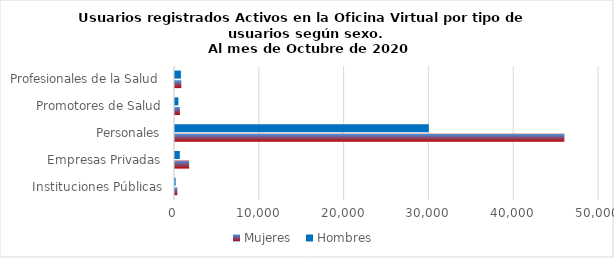
| Category | Mujeres | Hombres |
|---|---|---|
| Instituciones Públicas | 275 | 73 |
| Empresas Privadas | 1668 | 570 |
| Personales | 45918 | 29932 |
| Promotores de Salud | 583 | 400 |
| Profesionales de la Salud | 744 | 700 |